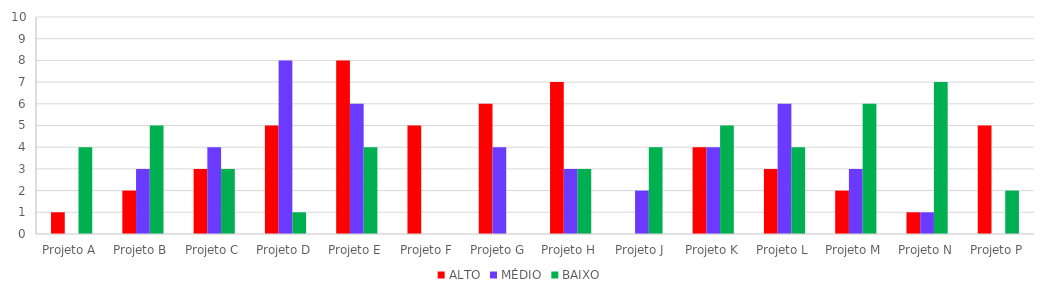
| Category | ALTO | MÉDIO | BAIXO |
|---|---|---|---|
| Projeto A | 1 | 0 | 4 |
| Projeto B | 2 | 3 | 5 |
| Projeto C | 3 | 4 | 3 |
| Projeto D | 5 | 8 | 1 |
| Projeto E | 8 | 6 | 4 |
| Projeto F | 5 | 0 | 0 |
| Projeto G | 6 | 4 | 0 |
| Projeto H | 7 | 3 | 3 |
| Projeto J | 0 | 2 | 4 |
| Projeto K | 4 | 4 | 5 |
| Projeto L | 3 | 6 | 4 |
| Projeto M | 2 | 3 | 6 |
| Projeto N | 1 | 1 | 7 |
| Projeto P | 5 | 0 | 2 |